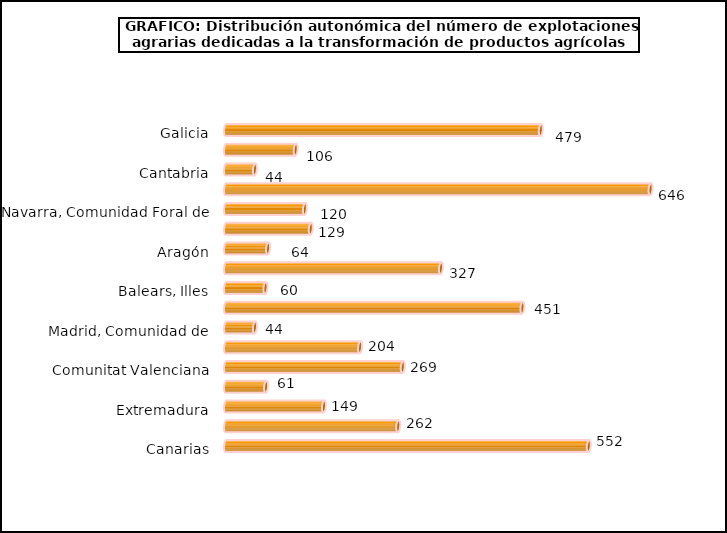
| Category | num. Explotaciones |
|---|---|
| Galicia | 479 |
| Asturias, Principado de | 106 |
| Cantabria | 44 |
| País Vasco | 646 |
| Navarra, Comunidad Foral de | 120 |
| Rioja, La | 129 |
| Aragón | 64 |
| Cataluña | 327 |
| Balears, Illes | 60 |
| Castilla y León | 451 |
| Madrid, Comunidad de | 44 |
| Castilla - La Mancha | 204 |
| Comunitat Valenciana | 269 |
| Murcia, Región de | 61 |
| Extremadura | 149 |
| Andalucía | 262 |
| Canarias | 552 |